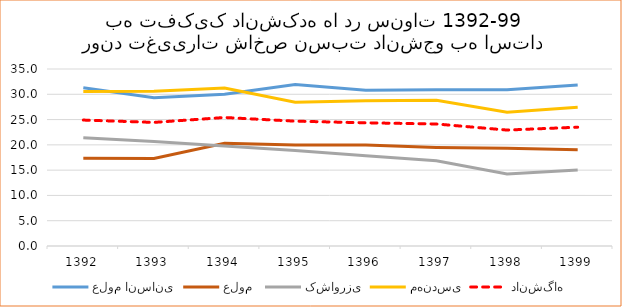
| Category | علوم انسانی | علوم  | کشاورزی | مهندسی | دانشگاه |
|---|---|---|---|---|---|
| 1392.0 | 31.31 | 17.362 | 21.417 | 30.558 | 24.903 |
| 1393.0 | 29.324 | 17.297 | 20.686 | 30.577 | 24.442 |
| 1394.0 | 30.026 | 20.294 | 19.79 | 31.241 | 25.411 |
| 1395.0 | 31.924 | 19.982 | 18.893 | 28.437 | 24.686 |
| 1396.0 | 30.79 | 19.956 | 17.852 | 28.709 | 24.361 |
| 1397.0 | 30.893 | 19.5 | 16.867 | 28.803 | 24.126 |
| 1398.0 | 30.92 | 19.327 | 14.235 | 26.465 | 22.925 |
| 1399.0 | 31.816 | 19.036 | 15.024 | 27.423 | 23.496 |